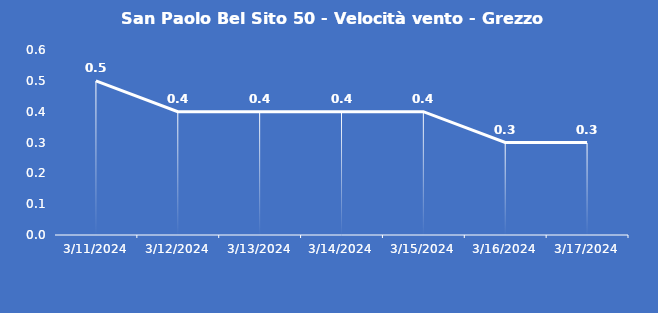
| Category | San Paolo Bel Sito 50 - Velocità vento - Grezzo (m/s) |
|---|---|
| 3/11/24 | 0.5 |
| 3/12/24 | 0.4 |
| 3/13/24 | 0.4 |
| 3/14/24 | 0.4 |
| 3/15/24 | 0.4 |
| 3/16/24 | 0.3 |
| 3/17/24 | 0.3 |